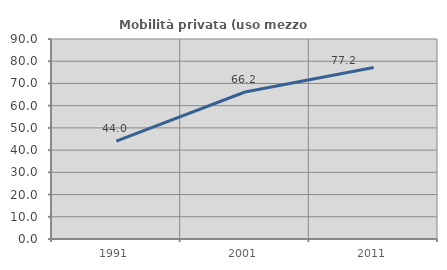
| Category | Mobilità privata (uso mezzo privato) |
|---|---|
| 1991.0 | 44 |
| 2001.0 | 66.161 |
| 2011.0 | 77.174 |